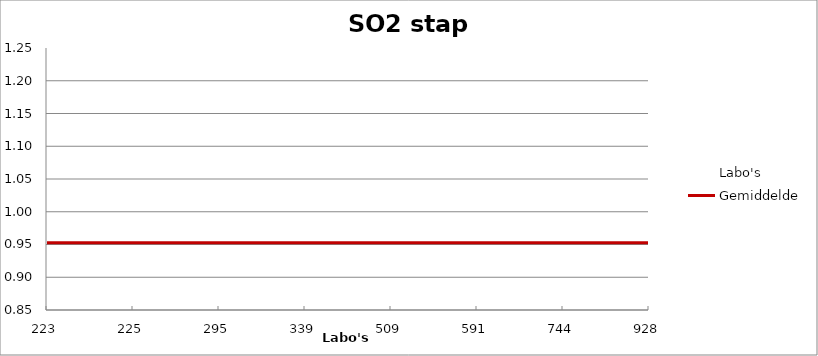
| Category | Labo's | Gemiddelde |
|---|---|---|
| 223.0 | 0.944 | 0.953 |
| 225.0 | 0.857 | 0.953 |
| 295.0 | 0.92 | 0.953 |
| 339.0 | 0.956 | 0.953 |
| 509.0 | 0.945 | 0.953 |
| 591.0 | 0.994 | 0.953 |
| 744.0 | 0.956 | 0.953 |
| 928.0 | 1.25 | 0.953 |